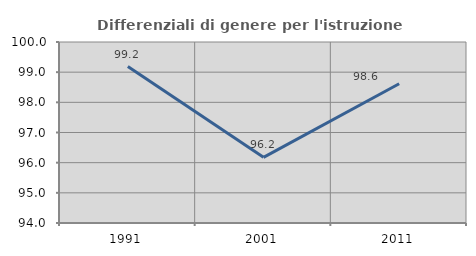
| Category | Differenziali di genere per l'istruzione superiore |
|---|---|
| 1991.0 | 99.187 |
| 2001.0 | 96.178 |
| 2011.0 | 98.615 |